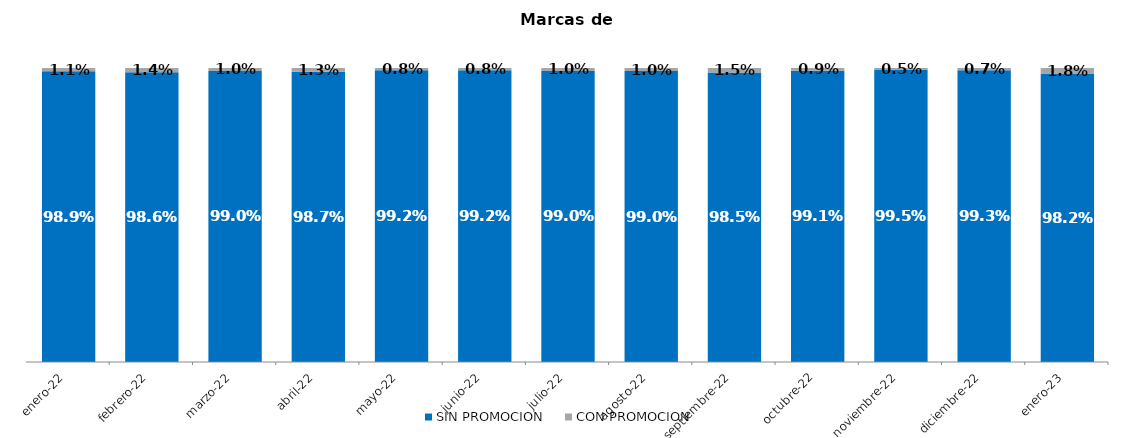
| Category | SIN PROMOCION   | CON PROMOCION   |
|---|---|---|
| 2022-01-01 | 0.989 | 0.011 |
| 2022-02-01 | 0.986 | 0.014 |
| 2022-03-01 | 0.99 | 0.01 |
| 2022-04-01 | 0.987 | 0.013 |
| 2022-05-01 | 0.992 | 0.008 |
| 2022-06-01 | 0.992 | 0.008 |
| 2022-07-01 | 0.99 | 0.01 |
| 2022-08-01 | 0.99 | 0.01 |
| 2022-09-01 | 0.985 | 0.015 |
| 2022-10-01 | 0.991 | 0.009 |
| 2022-11-01 | 0.995 | 0.005 |
| 2022-12-01 | 0.993 | 0.007 |
| 2023-01-01 | 0.982 | 0.018 |